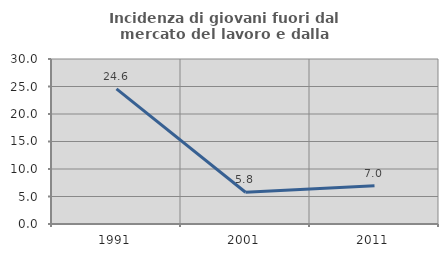
| Category | Incidenza di giovani fuori dal mercato del lavoro e dalla formazione  |
|---|---|
| 1991.0 | 24.561 |
| 2001.0 | 5.769 |
| 2011.0 | 6.977 |